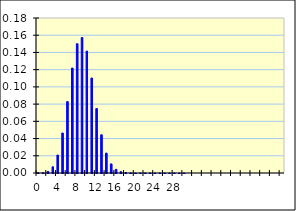
| Category | Series 0 |
|---|---|
| 0 | 0 |
| 1 | 0 |
| 2 | 0.002 |
| 3 | 0.007 |
| 4 | 0.021 |
| 5 | 0.046 |
| 6 | 0.083 |
| 7 | 0.122 |
| 8 | 0.15 |
| 9 | 0.157 |
| 10 | 0.142 |
| 11 | 0.11 |
| 12 | 0.075 |
| 13 | 0.044 |
| 14 | 0.023 |
| 15 | 0.011 |
| 16 | 0.004 |
| 17 | 0.001 |
| 18 | 0 |
| 19 | 0 |
| 20 | 0 |
| 21 | 0 |
| 22 | 0 |
| 23 | 0 |
| 24 | 0 |
| 25 | 0 |
| 26 | 0 |
| 27 | 0 |
| 28 | 0 |
| 29 | 0 |
| 30 | 0 |